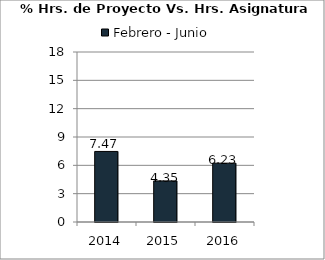
| Category | Febrero - Junio |
|---|---|
| 2014.0 | 7.47 |
| 2015.0 | 4.35 |
| 2016.0 | 6.23 |